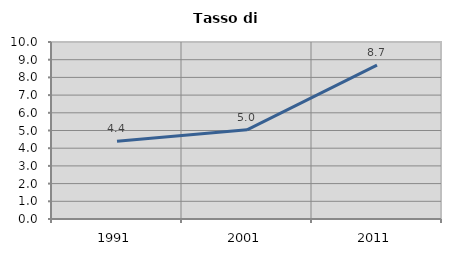
| Category | Tasso di disoccupazione   |
|---|---|
| 1991.0 | 4.396 |
| 2001.0 | 5.036 |
| 2011.0 | 8.696 |